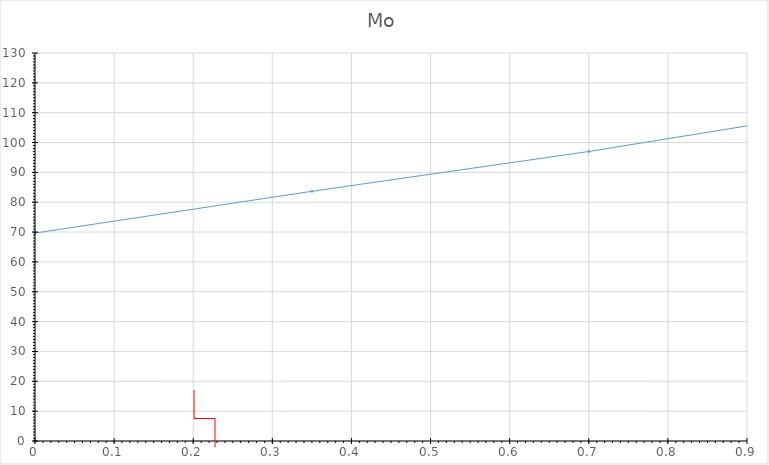
| Category | Series 0 |
|---|---|
| 0.0 | 69.667 |
| 0.35 | 83.667 |
| 0.7 | 97 |
| 1.05 | 112 |
| 1.4 | 126 |
| 1.75 | 139.667 |
| 2.1 | 145.333 |
| 2.45 | 171.667 |
| 2.8 | 174.333 |
| 3.15 | 180.333 |
| 3.5 | 324.333 |